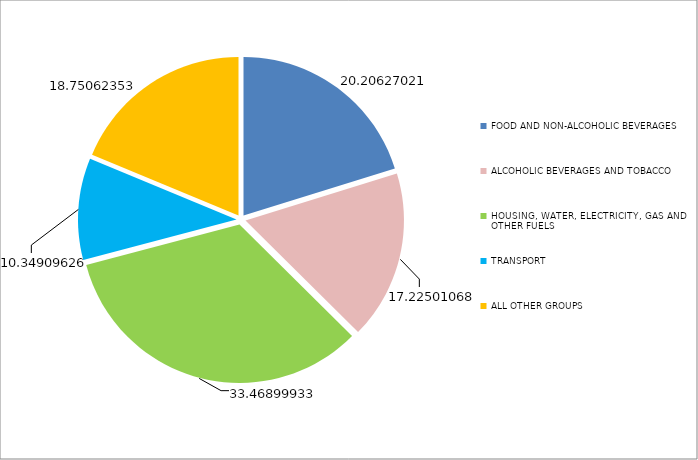
| Category | Series 0 |
|---|---|
| FOOD AND NON-ALCOHOLIC BEVERAGES  | 20.206 |
| ALCOHOLIC BEVERAGES AND TOBACCO | 17.225 |
| HOUSING, WATER, ELECTRICITY, GAS AND OTHER FUELS | 33.469 |
| TRANSPORT | 10.349 |
| ALL OTHER GROUPS | 18.751 |